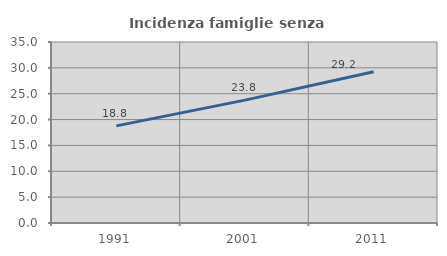
| Category | Incidenza famiglie senza nuclei |
|---|---|
| 1991.0 | 18.782 |
| 2001.0 | 23.758 |
| 2011.0 | 29.24 |